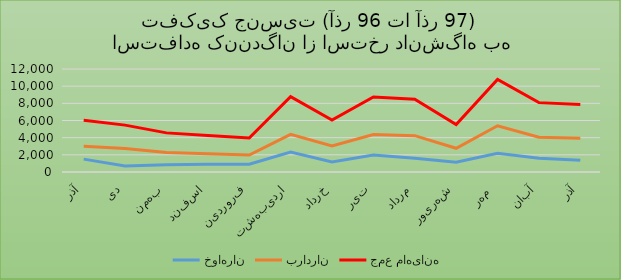
| Category | خواهران | برادران | جمع ماهیانه |
|---|---|---|---|
| آذر | 1501 | 1510 | 3011 |
| دی | 713 | 2017 | 2730 |
| بهمن | 854 | 1425 | 2279 |
| اسفند | 906 | 1225 | 2131 |
| فروردین | 898 | 1084 | 1982 |
| اردیبهشت | 2333 | 2053 | 4386 |
| خرداد | 1177 | 1847 | 3024 |
| تیر | 1986 | 2380 | 4366 |
| مرداد | 1596 | 2640 | 4236 |
| شهریور | 1141 | 1622 | 2763 |
| مهر  | 2178 | 3212 | 5390 |
| آبان | 1609 | 2432 | 4041 |
| آذر | 1367 | 2565 | 3932 |